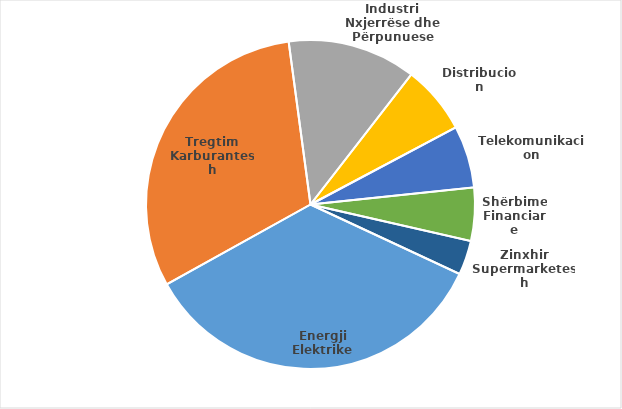
| Category | Series 0 |
|---|---|
| Energji Elektrike | 254106456415 |
| Tregtim Karburantesh | 224726286136 |
| Industri Nxjerrëse dhe Përpunuese | 91674000000 |
| Distribucion | 48903765025 |
| Telekomunikacion | 44355308238 |
| Shërbime Financiare | 38011561000 |
| Zinxhir Supermarketesh | 24481000000 |